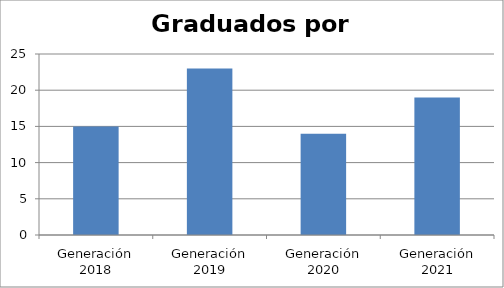
| Category | Series 0 |
|---|---|
| Generación 2018 | 15 |
| Generación 2019 | 23 |
| Generación 2020 | 14 |
| Generación 2021 | 19 |